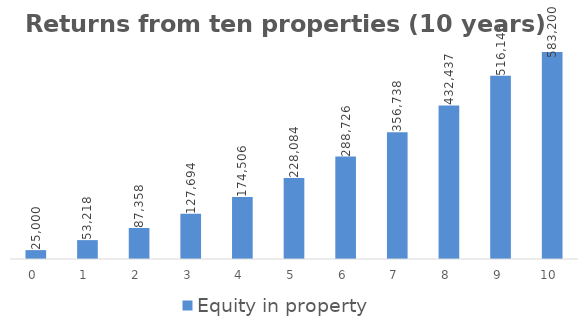
| Category | Equity in property  | Total equity  |
|---|---|---|
| 0.0 | 25000 | 25000 |
| 1.0 | 53218.328 | 53218.328 |
| 2.0 | 87358.282 | 87358.282 |
| 3.0 | 127693.607 | 127693.607 |
| 4.0 | 174505.593 | 174505.593 |
| 5.0 | 228083.697 | 228083.697 |
| 6.0 | 288725.785 | 288725.785 |
| 7.0 | 356738.392 | 356738.392 |
| 8.0 | 432436.982 | 432436.982 |
| 9.0 | 516146.223 | 516146.223 |
| 10.0 | 583200.266 | 583200.266 |